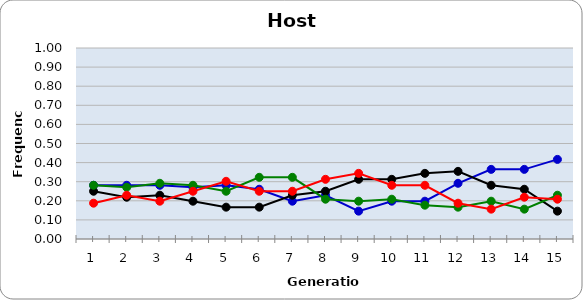
| Category | Sp | Cl | Di | He |
|---|---|---|---|---|
| 1.0 | 0.281 | 0.25 | 0.281 | 0.188 |
| 2.0 | 0.281 | 0.219 | 0.271 | 0.229 |
| 3.0 | 0.281 | 0.229 | 0.292 | 0.198 |
| 4.0 | 0.271 | 0.198 | 0.281 | 0.25 |
| 5.0 | 0.281 | 0.167 | 0.25 | 0.302 |
| 6.0 | 0.26 | 0.167 | 0.323 | 0.25 |
| 7.0 | 0.198 | 0.229 | 0.323 | 0.25 |
| 8.0 | 0.229 | 0.25 | 0.208 | 0.312 |
| 9.0 | 0.146 | 0.312 | 0.198 | 0.344 |
| 10.0 | 0.198 | 0.312 | 0.208 | 0.281 |
| 11.0 | 0.198 | 0.344 | 0.177 | 0.281 |
| 12.0 | 0.292 | 0.354 | 0.167 | 0.188 |
| 13.0 | 0.365 | 0.281 | 0.198 | 0.156 |
| 14.0 | 0.365 | 0.26 | 0.156 | 0.219 |
| 15.0 | 0.417 | 0.146 | 0.229 | 0.208 |